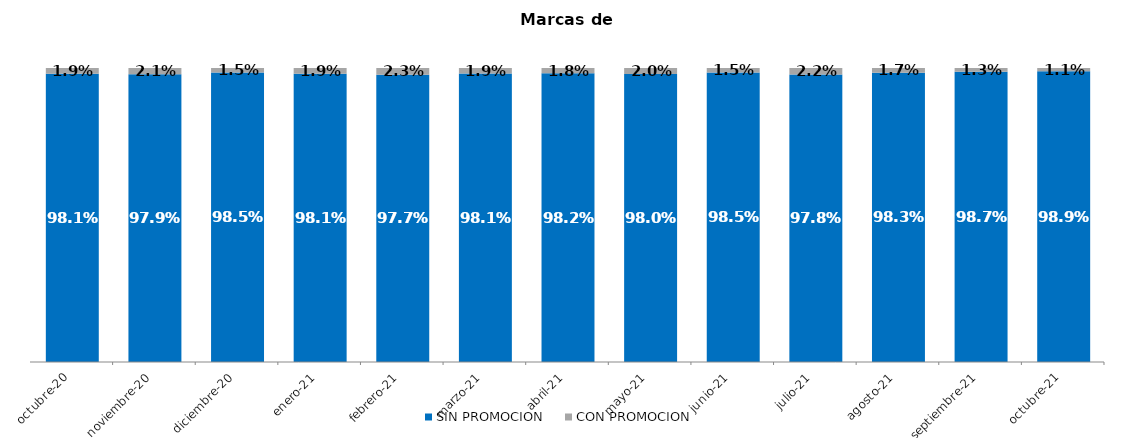
| Category | SIN PROMOCION   | CON PROMOCION   |
|---|---|---|
| 2020-10-01 | 0.981 | 0.019 |
| 2020-11-01 | 0.979 | 0.021 |
| 2020-12-01 | 0.985 | 0.015 |
| 2021-01-01 | 0.981 | 0.019 |
| 2021-02-01 | 0.977 | 0.023 |
| 2021-03-01 | 0.981 | 0.019 |
| 2021-04-01 | 0.982 | 0.018 |
| 2021-05-01 | 0.98 | 0.02 |
| 2021-06-01 | 0.985 | 0.015 |
| 2021-07-01 | 0.978 | 0.022 |
| 2021-08-01 | 0.983 | 0.017 |
| 2021-09-01 | 0.987 | 0.013 |
| 2021-10-01 | 0.989 | 0.011 |